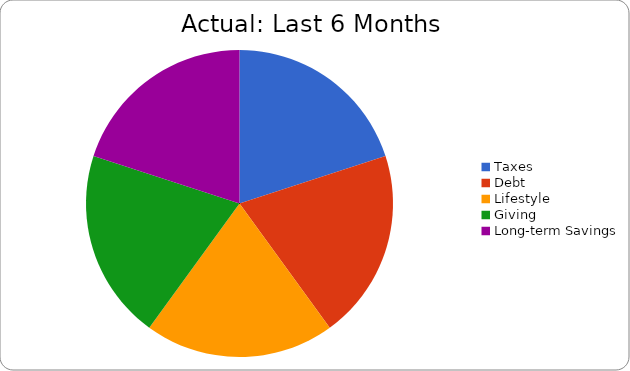
| Category | Series 0 |
|---|---|
| Taxes | 0.2 |
| Debt | 0.2 |
| Lifestyle | 0.2 |
| Giving | 0.2 |
| Long-term Savings | 0.2 |